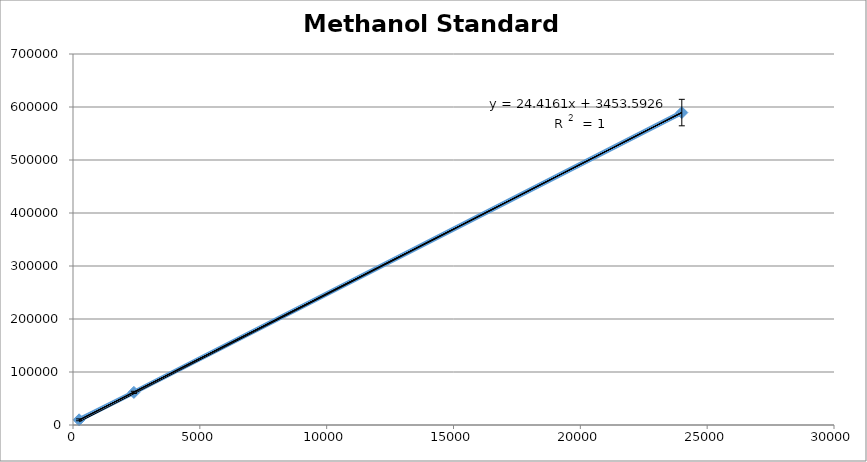
| Category | y-values |
|---|---|
| 240.0 | 9781.333 |
| 2400.0 | 61537.667 |
| 24000.0 | 589487.667 |